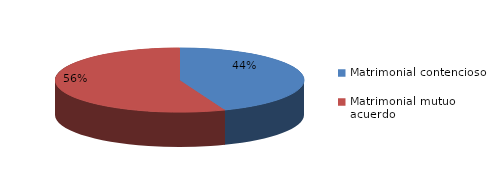
| Category | Series 0 |
|---|---|
| 0 | 1703 |
| 1 | 2162 |